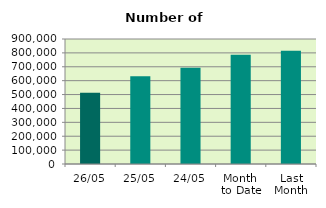
| Category | Series 0 |
|---|---|
| 26/05 | 512240 |
| 25/05 | 631780 |
| 24/05 | 693130 |
| Month 
to Date | 786214.632 |
| Last
Month | 814883.684 |